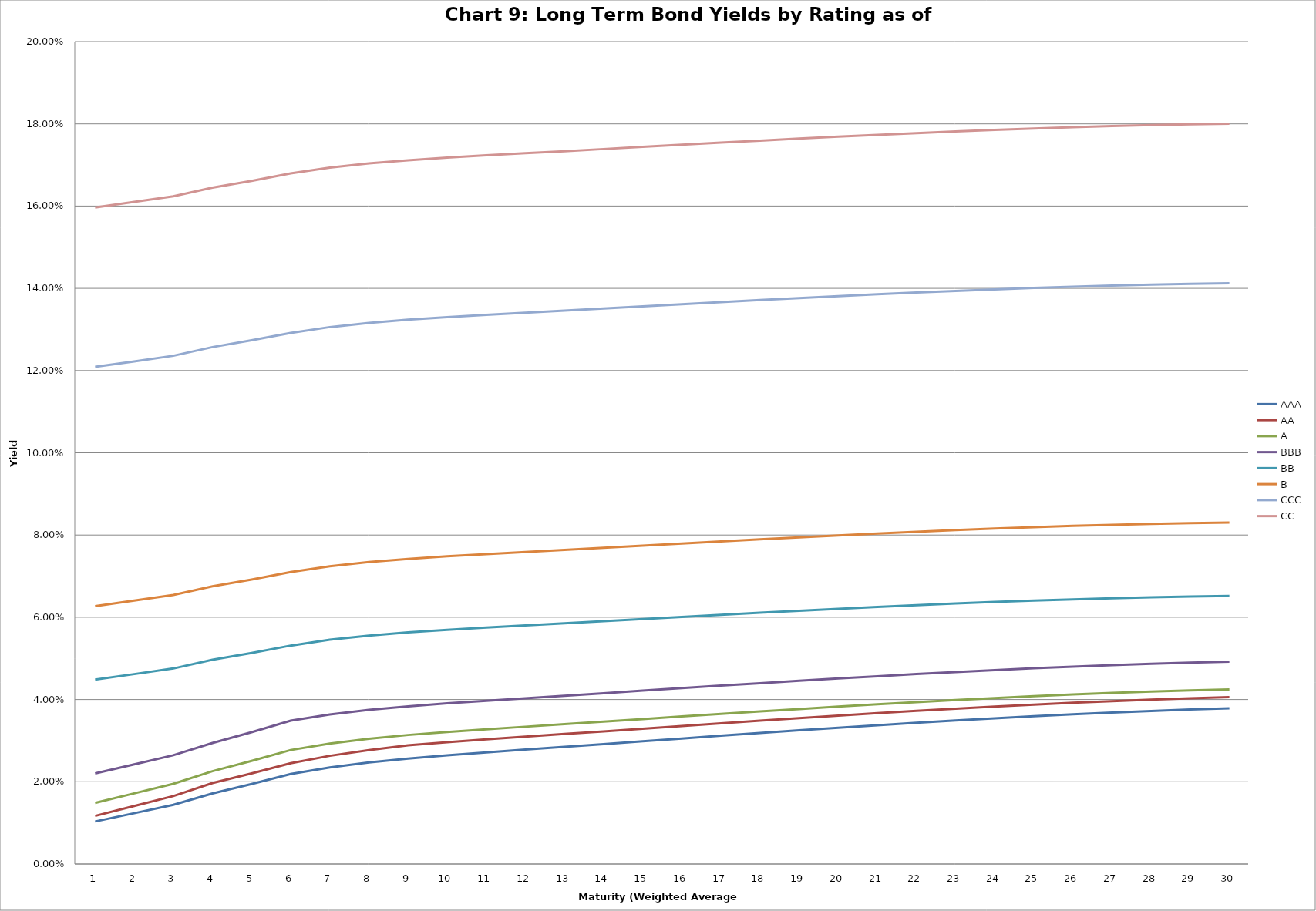
| Category | AAA | AA | A | BBB | BB | B | CCC | CC |
|---|---|---|---|---|---|---|---|---|
| 0 | 0.01 | 0.012 | 0.015 | 0.022 | 0.045 | 0.063 | 0.121 | 0.16 |
| 1 | 0.012 | 0.014 | 0.017 | 0.024 | 0.046 | 0.064 | 0.122 | 0.161 |
| 2 | 0.014 | 0.017 | 0.019 | 0.026 | 0.048 | 0.065 | 0.124 | 0.162 |
| 3 | 0.017 | 0.02 | 0.023 | 0.029 | 0.05 | 0.068 | 0.126 | 0.164 |
| 4 | 0.019 | 0.022 | 0.025 | 0.032 | 0.051 | 0.069 | 0.127 | 0.166 |
| 5 | 0.022 | 0.025 | 0.028 | 0.035 | 0.053 | 0.071 | 0.129 | 0.168 |
| 6 | 0.023 | 0.026 | 0.029 | 0.036 | 0.055 | 0.072 | 0.131 | 0.169 |
| 7 | 0.025 | 0.028 | 0.03 | 0.037 | 0.056 | 0.073 | 0.132 | 0.17 |
| 8 | 0.026 | 0.029 | 0.031 | 0.038 | 0.056 | 0.074 | 0.132 | 0.171 |
| 9 | 0.026 | 0.03 | 0.032 | 0.039 | 0.057 | 0.075 | 0.133 | 0.172 |
| 10 | 0.027 | 0.03 | 0.033 | 0.04 | 0.057 | 0.075 | 0.134 | 0.172 |
| 11 | 0.028 | 0.031 | 0.033 | 0.04 | 0.058 | 0.076 | 0.134 | 0.173 |
| 12 | 0.028 | 0.032 | 0.034 | 0.041 | 0.059 | 0.076 | 0.135 | 0.173 |
| 13 | 0.029 | 0.032 | 0.035 | 0.042 | 0.059 | 0.077 | 0.135 | 0.174 |
| 14 | 0.03 | 0.033 | 0.035 | 0.042 | 0.06 | 0.077 | 0.136 | 0.174 |
| 15 | 0.031 | 0.034 | 0.036 | 0.043 | 0.06 | 0.078 | 0.136 | 0.175 |
| 16 | 0.031 | 0.034 | 0.036 | 0.043 | 0.061 | 0.078 | 0.137 | 0.175 |
| 17 | 0.032 | 0.035 | 0.037 | 0.044 | 0.061 | 0.079 | 0.137 | 0.176 |
| 18 | 0.033 | 0.035 | 0.038 | 0.045 | 0.062 | 0.079 | 0.138 | 0.176 |
| 19 | 0.033 | 0.036 | 0.038 | 0.045 | 0.062 | 0.08 | 0.138 | 0.177 |
| 20 | 0.034 | 0.037 | 0.039 | 0.046 | 0.063 | 0.08 | 0.139 | 0.177 |
| 21 | 0.034 | 0.037 | 0.039 | 0.046 | 0.063 | 0.081 | 0.139 | 0.178 |
| 22 | 0.035 | 0.038 | 0.04 | 0.047 | 0.063 | 0.081 | 0.139 | 0.178 |
| 23 | 0.035 | 0.038 | 0.04 | 0.047 | 0.064 | 0.082 | 0.14 | 0.179 |
| 24 | 0.036 | 0.039 | 0.041 | 0.048 | 0.064 | 0.082 | 0.14 | 0.179 |
| 25 | 0.036 | 0.039 | 0.041 | 0.048 | 0.064 | 0.082 | 0.14 | 0.179 |
| 26 | 0.037 | 0.04 | 0.042 | 0.048 | 0.065 | 0.082 | 0.141 | 0.179 |
| 27 | 0.037 | 0.04 | 0.042 | 0.049 | 0.065 | 0.083 | 0.141 | 0.18 |
| 28 | 0.038 | 0.04 | 0.042 | 0.049 | 0.065 | 0.083 | 0.141 | 0.18 |
| 29 | 0.038 | 0.041 | 0.042 | 0.049 | 0.065 | 0.083 | 0.141 | 0.18 |